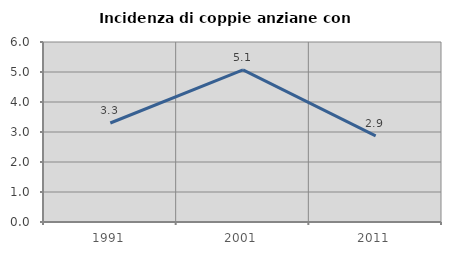
| Category | Incidenza di coppie anziane con figli |
|---|---|
| 1991.0 | 3.3 |
| 2001.0 | 5.07 |
| 2011.0 | 2.868 |